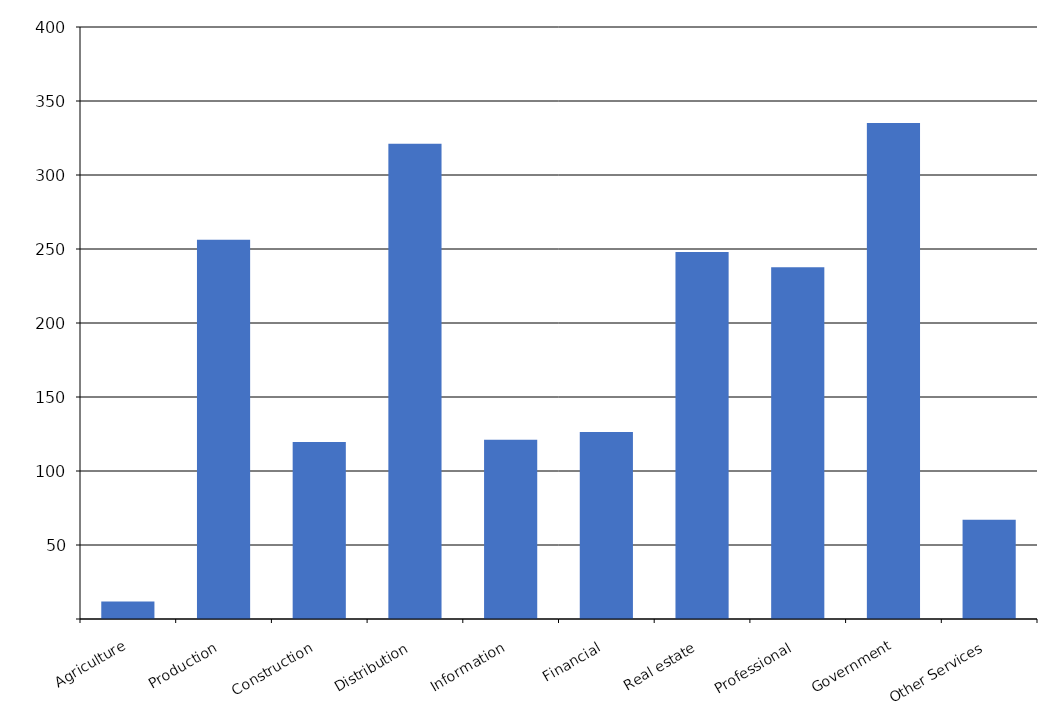
| Category | Series 0 |
|---|---|
| Agriculture | 11867 |
| Production | 256285 |
| Construction | 119555 |
| Distribution | 321127 |
| Information | 121113 |
| Financial | 126406 |
| Real estate | 247920 |
| Professional | 237637 |
| Government | 335090 |
| Other Services | 67010 |